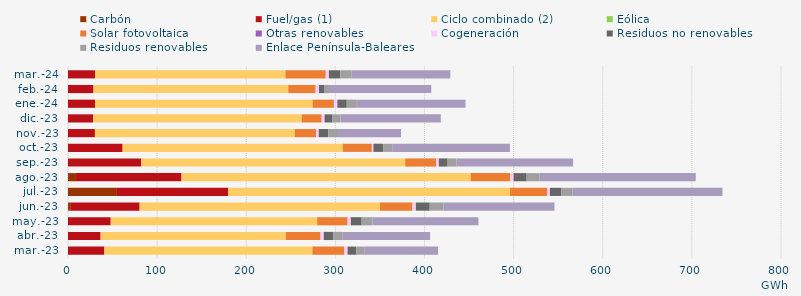
| Category | Carbón | Fuel/gas (1) | Ciclo combinado (2) | Eólica | Solar fotovoltaica | Otras renovables | Cogeneración | Residuos no renovables | Residuos renovables | Enlace Península-Baleares |
|---|---|---|---|---|---|---|---|---|---|---|
| mar.-23 | -0.518 | 40.752 | 233.282 | 0.2 | 35.775 | 0.112 | 3.577 | 9.638 | 9.638 | 82.194 |
| abr.-23 | -0.609 | 36.577 | 207.738 | 0.127 | 38.851 | 0.074 | 3.618 | 10.657 | 10.657 | 98.033 |
| may.-23 | -0.833 | 47.925 | 231.475 | 0.25 | 34.005 | 0.09 | 3.517 | 12.229 | 12.229 | 118.762 |
| jun.-23 | 3.18 | 77.204 | 269.55 | 0.056 | 36.423 | 0.084 | 3.783 | 15.598 | 15.598 | 124.35 |
| jul.-23 | 54.925 | 124.683 | 316.355 | 0.119 | 41.343 | 0.037 | 3.245 | 12.541 | 12.541 | 168.548 |
| ago.-23 | 9.023 | 118.34 | 324.377 | 0.098 | 44.373 | 0.027 | 3.74 | 14.683 | 14.683 | 175.009 |
| sep.-23 | -0.823 | 82.054 | 296.323 | 0 | 34.511 | 0.032 | 3.105 | 9.934 | 9.934 | 130.855 |
| oct.-23 | -0.827 | 61.254 | 247.113 | 0.01 | 32.549 | 0.04 | 1.729 | 10.861 | 10.861 | 131.447 |
| nov.-23 | -0.895 | 30.185 | 224.261 | 0.009 | 23.864 | 0.135 | 2.835 | 10.81 | 10.81 | 70.768 |
| dic.-23 | -0.696 | 28.263 | 233.915 | 0 | 22.335 | 0.126 | 3.21 | 8.992 | 8.992 | 112.44 |
| ene.-24 | -0.706 | 30.444 | 244.02 | 0 | 23.767 | 0.104 | 3.937 | 10.485 | 10.485 | 122.76 |
| feb.-24 | -0.663 | 28.622 | 218.491 | 0 | 30.74 | 0.04 | 3.74 | 5.609 | 5.609 | 114.744 |
| mar.-24 | -0.71 | 30.374 | 213.549 | 0 | 45.239 | 0.04 | 3.485 | 12.829 | 12.829 | 110.668 |